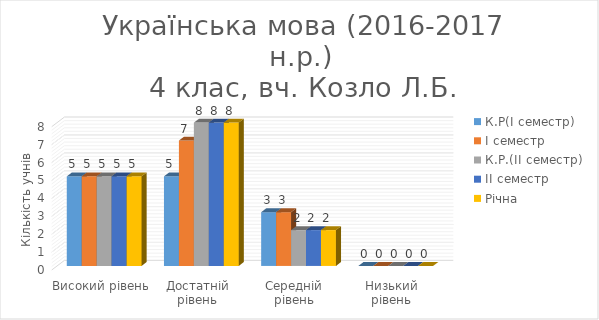
| Category | К.Р(І семестр) | І семестр | К.Р.(ІІ семестр) | ІІ семестр | Річна |
|---|---|---|---|---|---|
| Високий рівень | 5 | 5 | 5 | 5 | 5 |
| Достатній рівень | 5 | 7 | 8 | 8 | 8 |
| Середній рівень | 3 | 3 | 2 | 2 | 2 |
| Низький рівень | 0 | 0 | 0 | 0 | 0 |